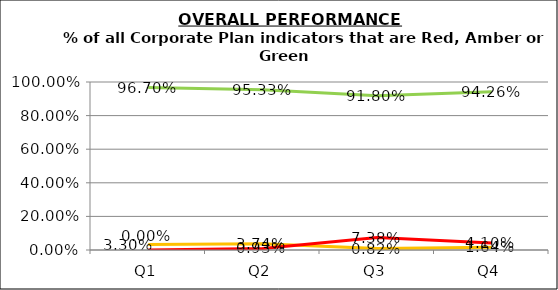
| Category | Green | Amber | Red |
|---|---|---|---|
| Q1 | 0.967 | 0.033 | 0 |
| Q2 | 0.953 | 0.037 | 0.009 |
| Q3 | 0.918 | 0.008 | 0.074 |
| Q4 | 0.943 | 0.016 | 0.041 |